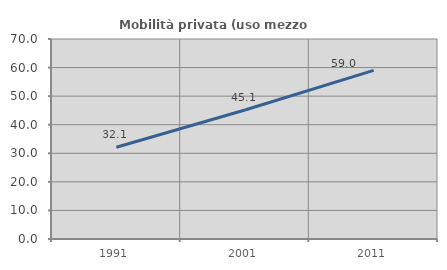
| Category | Mobilità privata (uso mezzo privato) |
|---|---|
| 1991.0 | 32.104 |
| 2001.0 | 45.13 |
| 2011.0 | 59.025 |